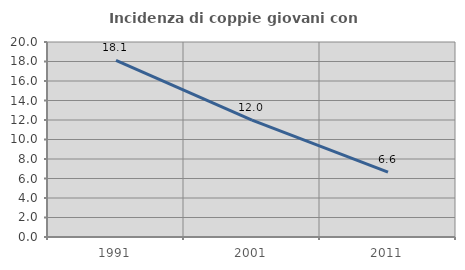
| Category | Incidenza di coppie giovani con figli |
|---|---|
| 1991.0 | 18.121 |
| 2001.0 | 11.994 |
| 2011.0 | 6.645 |